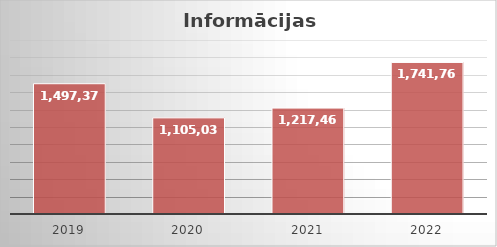
| Category | Series 0 |
|---|---|
| 2019.0 | 1497371 |
| 2020.0 | 1105036 |
| 2021.0 | 1217460 |
| 2022.0 | 1741769 |